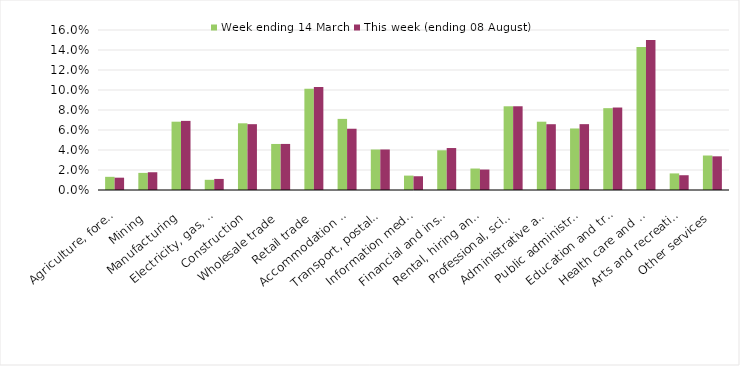
| Category | Week ending 14 March | This week (ending 08 August) |
|---|---|---|
| Agriculture, forestry and fishing | 0.013 | 0.012 |
| Mining | 0.017 | 0.018 |
| Manufacturing | 0.068 | 0.069 |
| Electricity, gas, water and waste services | 0.01 | 0.011 |
| Construction | 0.067 | 0.066 |
| Wholesale trade | 0.046 | 0.046 |
| Retail trade | 0.101 | 0.103 |
| Accommodation and food services | 0.071 | 0.061 |
| Transport, postal and warehousing | 0.04 | 0.041 |
| Information media and telecommunications | 0.014 | 0.014 |
| Financial and insurance services | 0.04 | 0.042 |
| Rental, hiring and real estate services | 0.021 | 0.02 |
| Professional, scientific and technical services | 0.084 | 0.084 |
| Administrative and support services | 0.068 | 0.066 |
| Public administration and safety | 0.062 | 0.066 |
| Education and training | 0.082 | 0.082 |
| Health care and social assistance | 0.143 | 0.15 |
| Arts and recreation services | 0.017 | 0.015 |
| Other services | 0.034 | 0.034 |